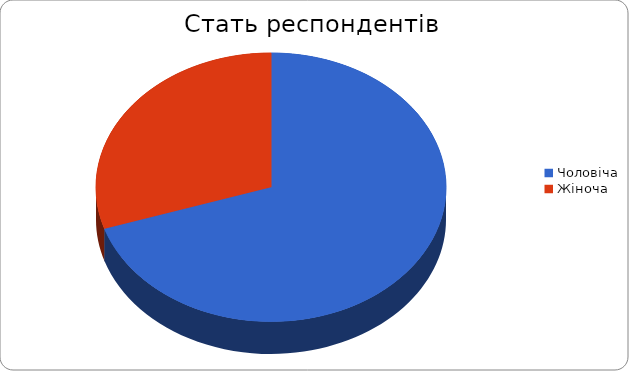
| Category | Series 0 |
|---|---|
| Чоловіча | 21 |
| Жіноча | 9 |